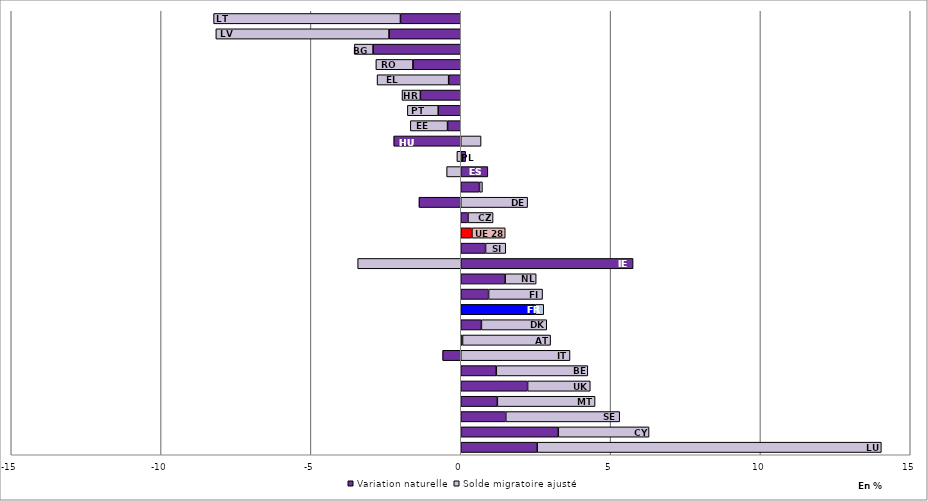
| Category | Variation naturelle | Solde migratoire ajusté |
|---|---|---|
| LU | 2.551 | 11.485 |
| CY | 3.256 | 3.028 |
| SE | 1.502 | 3.802 |
| MT | 1.222 | 3.26 |
| UK | 2.231 | 2.092 |
| BE | 1.186 | 3.054 |
| IT | -0.604 | 3.646 |
| AT | 0.059 | 2.939 |
| DK | 0.689 | 2.18 |
| FR | 2.483 | 0.286 |
| FI | 0.93 | 1.801 |
| NL | 1.483 | 1.034 |
| IE | 5.751 | -3.439 |
| SI | 0.828 | 0.673 |
| UE 28 | 0.373 | 1.111 |
| CZ | 0.242 | 0.837 |
| DE | -1.393 | 2.232 |
| SK | 0.626 | 0.098 |
| ES | 0.904 | -0.47 |
| PL | 0.165 | -0.127 |
| HU | -2.235 | 0.678 |
| EE | -0.441 | -1.241 |
| PT | -0.752 | -1.029 |
| HR | -1.347 | -0.613 |
| EL | -0.403 | -2.388 |
| RO | -1.596 | -1.236 |
| BG | -2.926 | -0.622 |
| LV | -2.394 | -5.778 |
| LT | -2.012 | -6.235 |